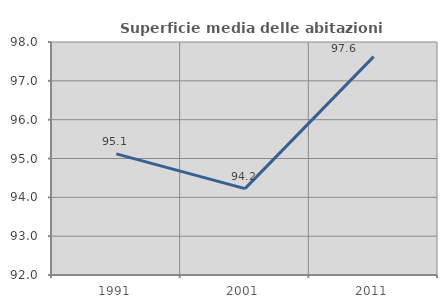
| Category | Superficie media delle abitazioni occupate |
|---|---|
| 1991.0 | 95.119 |
| 2001.0 | 94.224 |
| 2011.0 | 97.622 |